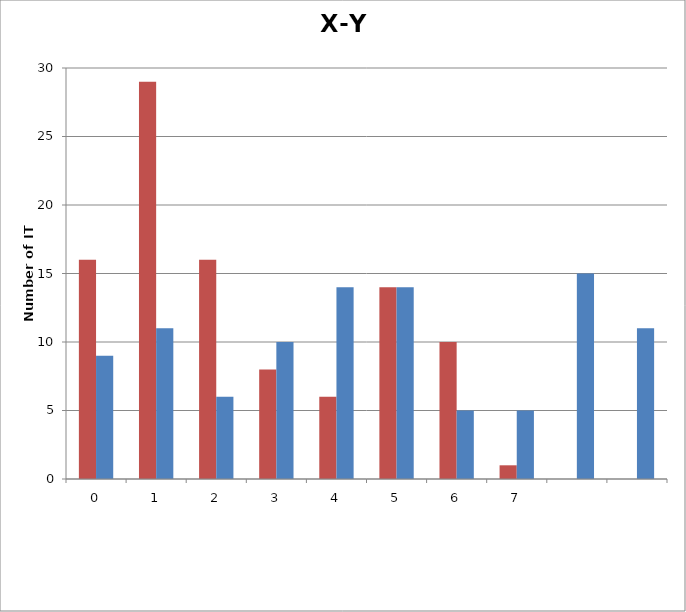
| Category | Series 1 | Series 0 |
|---|---|---|
| 0.0 | 16 | 9 |
| 1.0 | 29 | 11 |
| 2.0 | 16 | 6 |
| 3.0 | 8 | 10 |
| 4.0 | 6 | 14 |
| 5.0 | 14 | 14 |
| 6.0 | 10 | 5 |
| 7.0 | 1 | 5 |